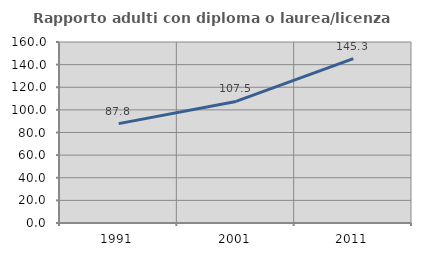
| Category | Rapporto adulti con diploma o laurea/licenza media  |
|---|---|
| 1991.0 | 87.826 |
| 2001.0 | 107.463 |
| 2011.0 | 145.316 |